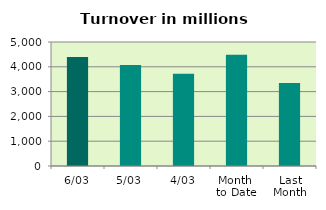
| Category | Series 0 |
|---|---|
| 6/03 | 4391.939 |
| 5/03 | 4075.088 |
| 4/03 | 3717.616 |
| Month 
to Date | 4483.088 |
| Last
Month | 3347.876 |